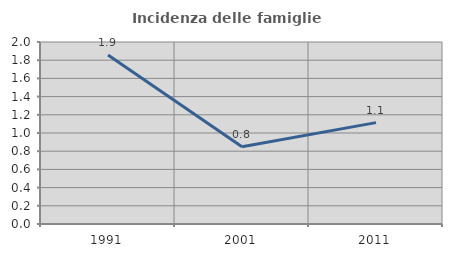
| Category | Incidenza delle famiglie numerose |
|---|---|
| 1991.0 | 1.858 |
| 2001.0 | 0.849 |
| 2011.0 | 1.114 |